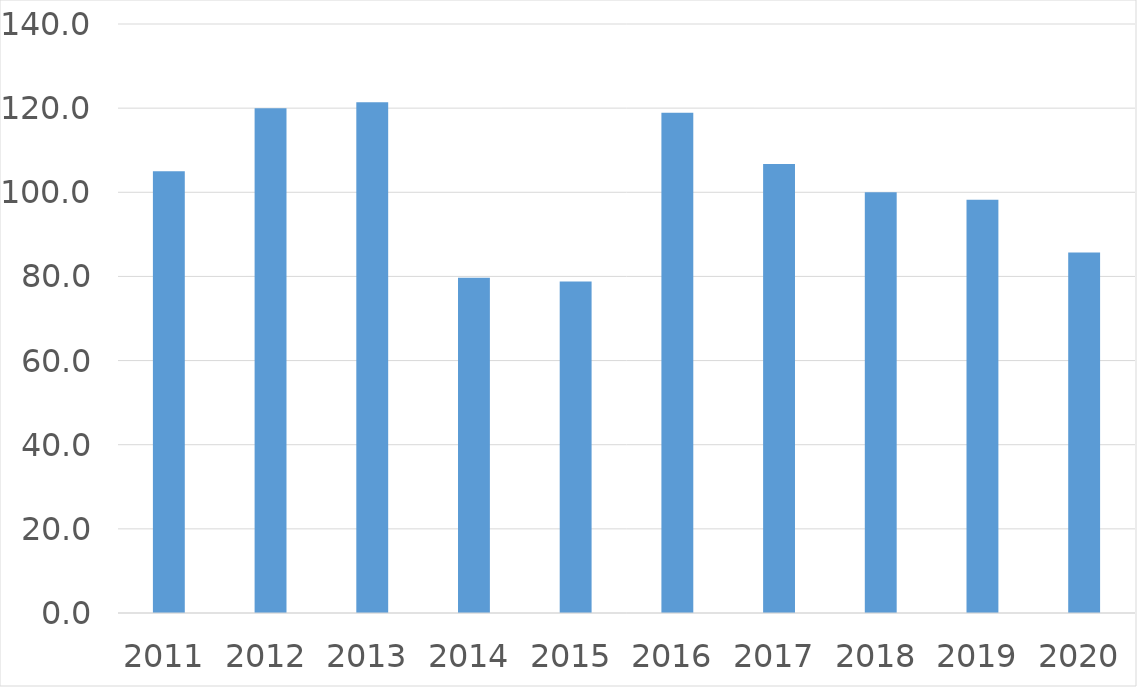
| Category | Series 0 |
|---|---|
| 2011 | 105 |
| 2012 | 120 |
| 2013 | 121.4 |
| 2014 | 79.7 |
| 2015 | 78.8 |
| 2016 | 118.9 |
| 2017 | 106.7 |
| 2018 | 100 |
| 2019 | 98.2 |
| 2020 | 85.7 |